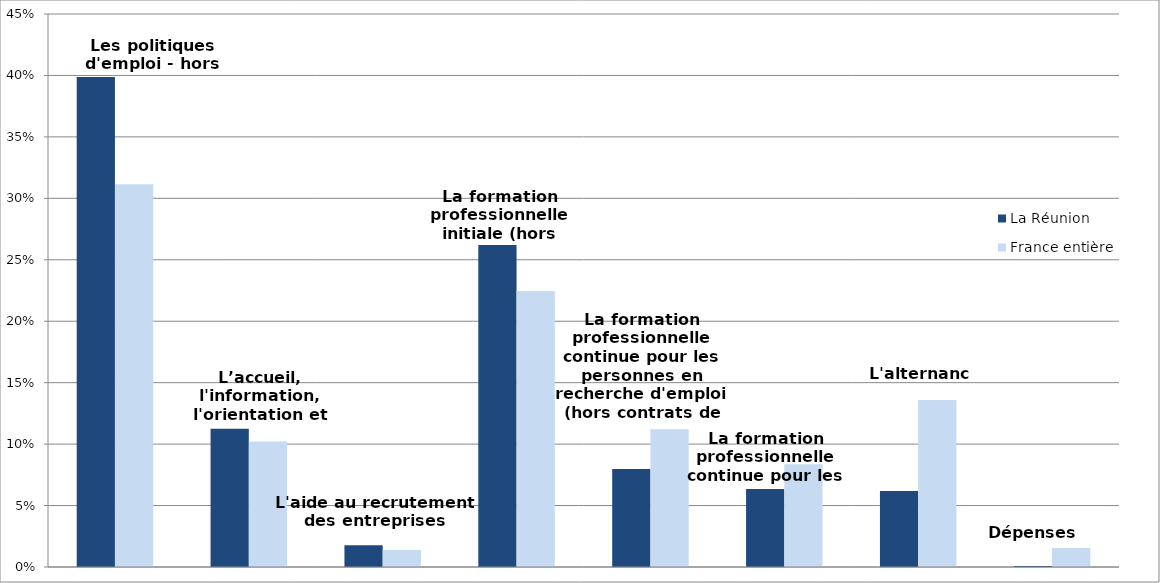
| Category | La Réunion | France entière |
|---|---|---|
| Les politiques d'emploi - hors mesures zonées | 0.399 | 0.311 |
| L’accueil, l'information, l'orientation et l'accompagnement | 0.112 | 0.102 |
| L'aide au recrutement des entreprises | 0.018 | 0.014 |
| La formation professionnelle initiale (hors apprentissage) | 0.262 | 0.225 |
| La formation professionnelle continue pour les personnes en recherche d'emploi (hors contrats de professionnalisation) | 0.08 | 0.112 |
| La formation professionnelle continue pour les actifs occupés | 0.064 | 0.084 |
| L'alternance | 0.062 | 0.136 |
| Dépenses non-ventilables | 0.001 | 0.015 |